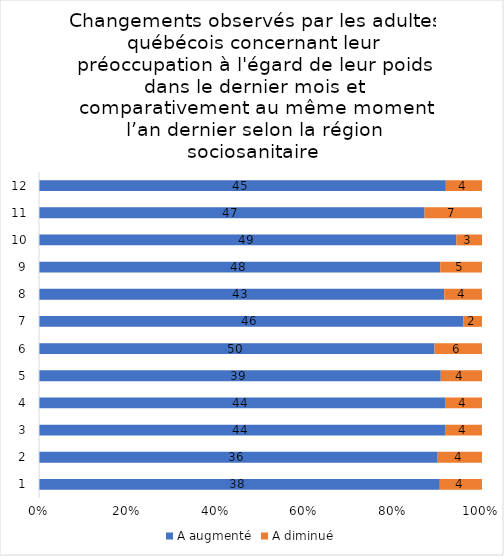
| Category | A augmenté | A diminué |
|---|---|---|
| 0 | 38 | 4 |
| 1 | 36 | 4 |
| 2 | 44 | 4 |
| 3 | 44 | 4 |
| 4 | 39 | 4 |
| 5 | 50 | 6 |
| 6 | 46 | 2 |
| 7 | 43 | 4 |
| 8 | 48 | 5 |
| 9 | 49 | 3 |
| 10 | 47 | 7 |
| 11 | 45 | 4 |